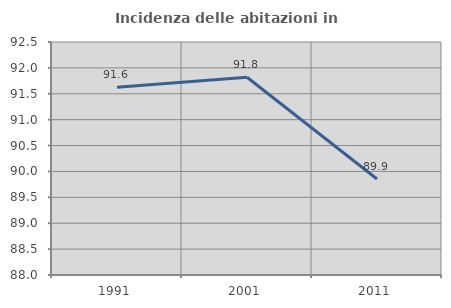
| Category | Incidenza delle abitazioni in proprietà  |
|---|---|
| 1991.0 | 91.628 |
| 2001.0 | 91.818 |
| 2011.0 | 89.855 |